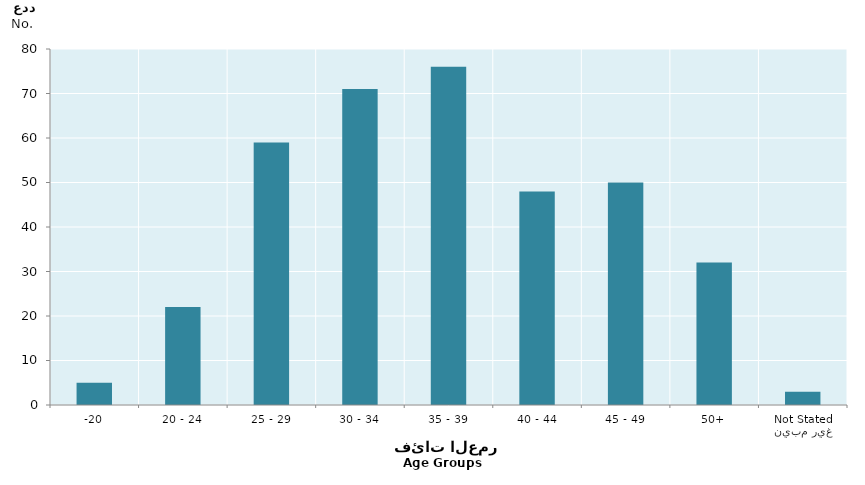
| Category | Series 0 |
|---|---|
| -20 | 5 |
| 20 - 24 | 22 |
| 25 - 29 | 59 |
| 30 - 34 | 71 |
| 35 - 39 | 76 |
| 40 - 44 | 48 |
| 45 - 49 | 50 |
| 50+ | 32 |
| غير مبين
Not Stated | 3 |